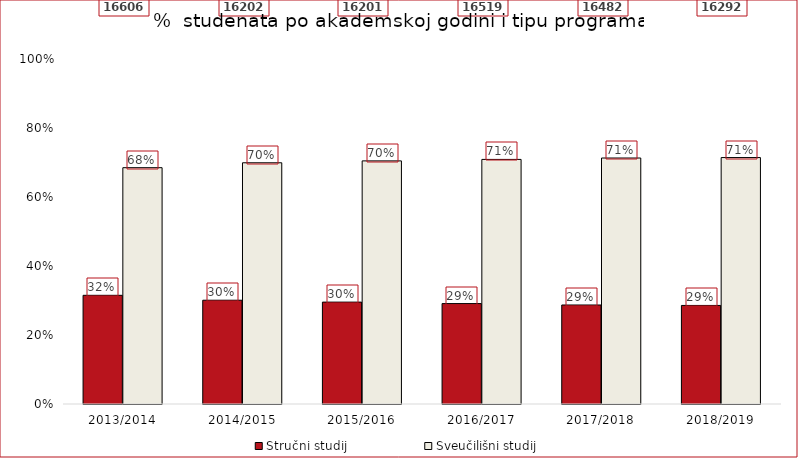
| Category | Stručni studij | Sveučilišni studij |
|---|---|---|
| 2013/2014 | 0.315 | 0.685 |
| 2014/2015 | 0.301 | 0.699 |
| 2015/2016 | 0.295 | 0.705 |
| 2016/2017 | 0.291 | 0.709 |
| 2017/2018 | 0.287 | 0.713 |
| 2018/2019 | 0.286 | 0.714 |